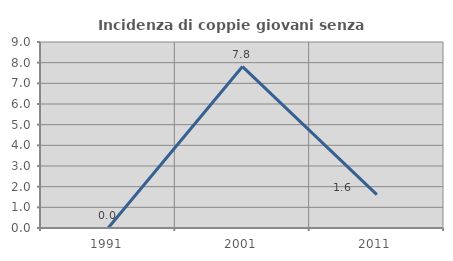
| Category | Incidenza di coppie giovani senza figli |
|---|---|
| 1991.0 | 0 |
| 2001.0 | 7.812 |
| 2011.0 | 1.613 |